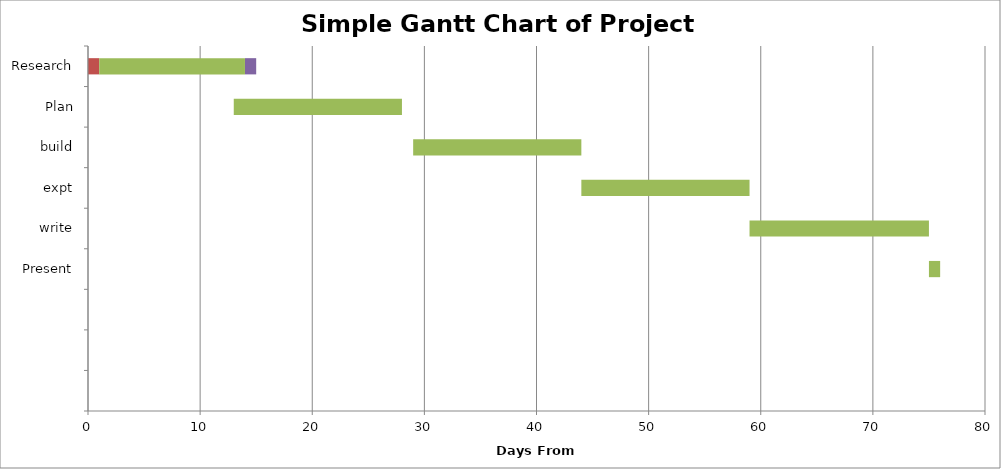
| Category | start | delay | delta | end delay |
|---|---|---|---|---|
| Research | 0 | 1 | 13 | 1 |
| Plan | 13 | 0 | 15 | 0 |
| build | 29 | 0 | 15 | 0 |
| expt | 44 | 0 | 15 | 0 |
| write | 59 | 0 | 16 | 0 |
| Present | 75 | 0 | 1 | 0 |